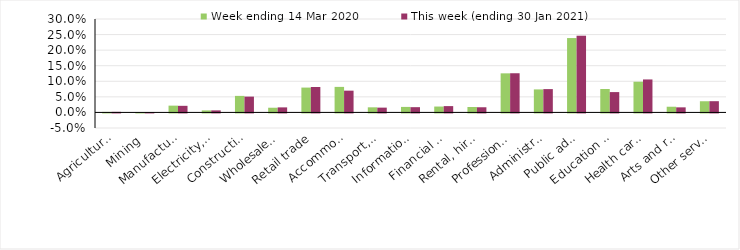
| Category | Week ending 14 Mar 2020 | This week (ending 30 Jan 2021) |
|---|---|---|
| Agriculture, forestry and fishing | 0.002 | 0.002 |
| Mining | 0.001 | 0.001 |
| Manufacturing | 0.022 | 0.021 |
| Electricity, gas, water and waste services | 0.006 | 0.007 |
| Construction | 0.053 | 0.051 |
| Wholesale trade | 0.015 | 0.016 |
| Retail trade | 0.08 | 0.082 |
| Accommodation and food services | 0.082 | 0.07 |
| Transport, postal and warehousing | 0.016 | 0.015 |
| Information media and telecommunications | 0.018 | 0.017 |
| Financial and insurance services | 0.019 | 0.02 |
| Rental, hiring and real estate services | 0.018 | 0.017 |
| Professional, scientific and technical services | 0.126 | 0.126 |
| Administrative and support services | 0.074 | 0.075 |
| Public administration and safety | 0.239 | 0.246 |
| Education and training | 0.075 | 0.065 |
| Health care and social assistance | 0.099 | 0.106 |
| Arts and recreation services | 0.018 | 0.016 |
| Other services | 0.036 | 0.036 |